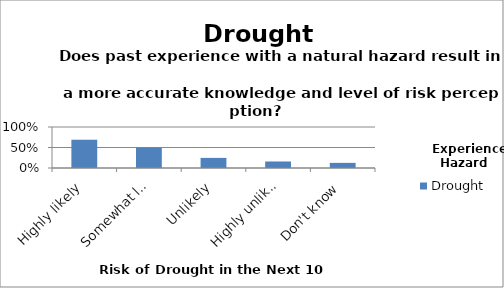
| Category | Drought |
|---|---|
| Highly likely | 0.69 |
| Somewhat likely | 0.5 |
| Unlikely | 0.246 |
| Highly unlikely | 0.159 |
| Don't know | 0.125 |